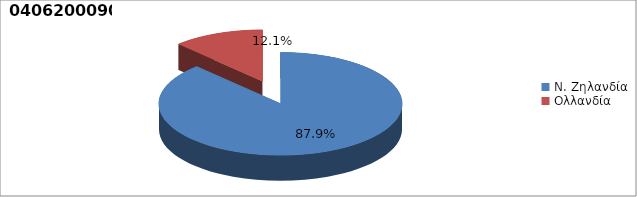
| Category | Series 0 |
|---|---|
| Ν. Ζηλανδία | 0.879 |
| Ολλανδία | 0.121 |